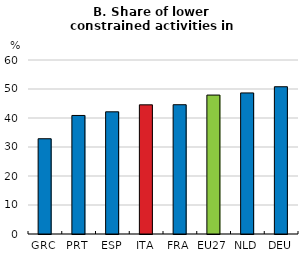
| Category | Share of Lower constrained sectors  |
|---|---|
| GRC | 32.85 |
| PRT | 40.874 |
| ESP | 42.13 |
| ITA | 44.542 |
| FRA | 44.576 |
| EU27 | 47.909 |
| NLD | 48.647 |
| DEU | 50.78 |